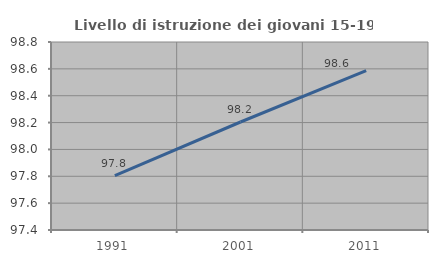
| Category | Livello di istruzione dei giovani 15-19 anni |
|---|---|
| 1991.0 | 97.805 |
| 2001.0 | 98.204 |
| 2011.0 | 98.587 |